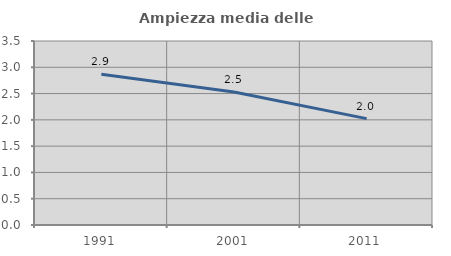
| Category | Ampiezza media delle famiglie |
|---|---|
| 1991.0 | 2.868 |
| 2001.0 | 2.53 |
| 2011.0 | 2.024 |